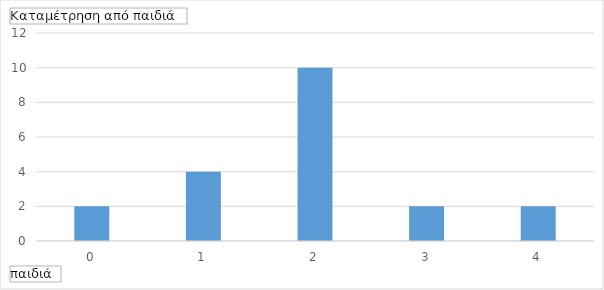
| Category | Άθροισμα |
|---|---|
| 0 | 2 |
| 1 | 4 |
| 2 | 10 |
| 3 | 2 |
| 4 | 2 |